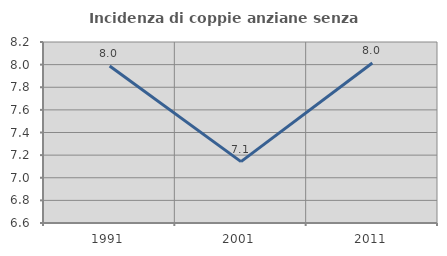
| Category | Incidenza di coppie anziane senza figli  |
|---|---|
| 1991.0 | 7.987 |
| 2001.0 | 7.143 |
| 2011.0 | 8.014 |